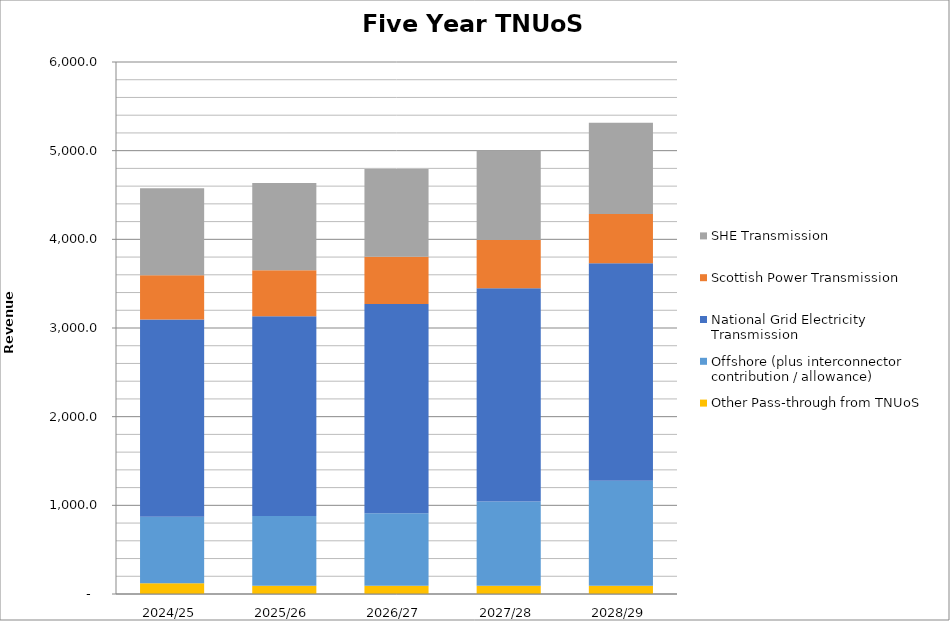
| Category |  Other Pass-through from TNUoS  |  Offshore (plus interconnector contribution / allowance)  |  National Grid Electricity Transmission  |  Scottish Power Transmission  |  SHE Transmission  |
|---|---|---|---|---|---|
| 2024/25 | 120.153 | 751.918 | 2223.09 | 500.874 | 979.833 |
| 2025/26 | 92.153 | 786.896 | 2254.07 | 517.091 | 985.316 |
| 2026/27 | 92.153 | 819.349 | 2358.599 | 533.224 | 989.799 |
| 2027/28 | 92.153 | 951.073 | 2405.771 | 543.685 | 1009.595 |
| 2028/29 | 92.153 | 1185.57 | 2453.886 | 554.558 | 1029.787 |